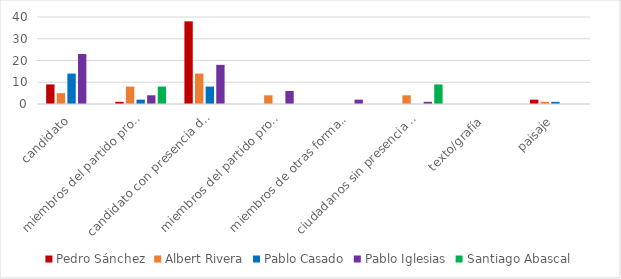
| Category | Pedro Sánchez | Albert Rivera | Pablo Casado | Pablo Iglesias | Santiago Abascal |
|---|---|---|---|---|---|
| candidato | 9 | 5 | 14 | 23 | 0 |
| miembros del partido propio | 1 | 8 | 2 | 4 | 8 |
| candidato con presencia de ciudadanos | 38 | 14 | 8 | 18 | 0 |
| miembros del partido propio con presencia de ciudadanos | 0 | 4 | 0 | 6 | 0 |
| miembros de otras formaciones políticas | 0 | 0 | 0 | 2 | 0 |
| ciudadanos sin presencia de políticos | 0 | 4 | 0 | 1 | 9 |
| texto/grafía | 0 | 0 | 0 | 0 | 0 |
| paisaje | 2 | 1 | 1 | 0 | 0 |